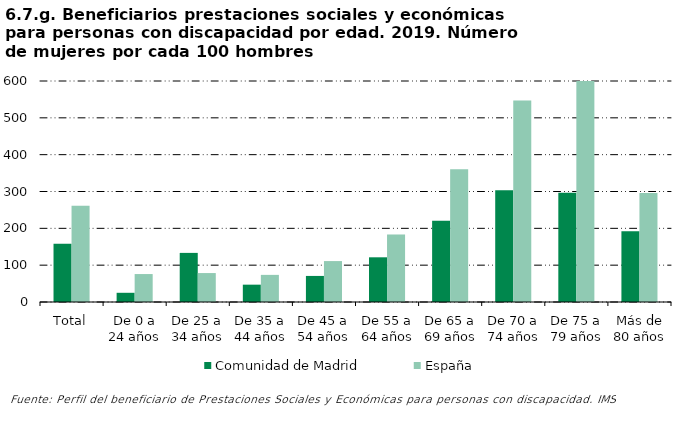
| Category | Comunidad de Madrid | España |
|---|---|---|
| Total | 157.971 | 261.296 |
| De 0 a 24 años | 25 | 75.862 |
| De 25 a 34 años | 133.333 | 78.571 |
| De 35 a 44 años | 47.059 | 73.656 |
| De 45 a 54 años | 70.769 | 111.081 |
| De 55 a 64 años | 121.348 | 183.158 |
| De 65 a 69 años | 220.588 | 360.106 |
| De 70 a 74 años | 303.571 | 546.835 |
| De 75 a 79 años | 296.429 | 605.917 |
| Más de 80 años | 192.241 | 295.779 |